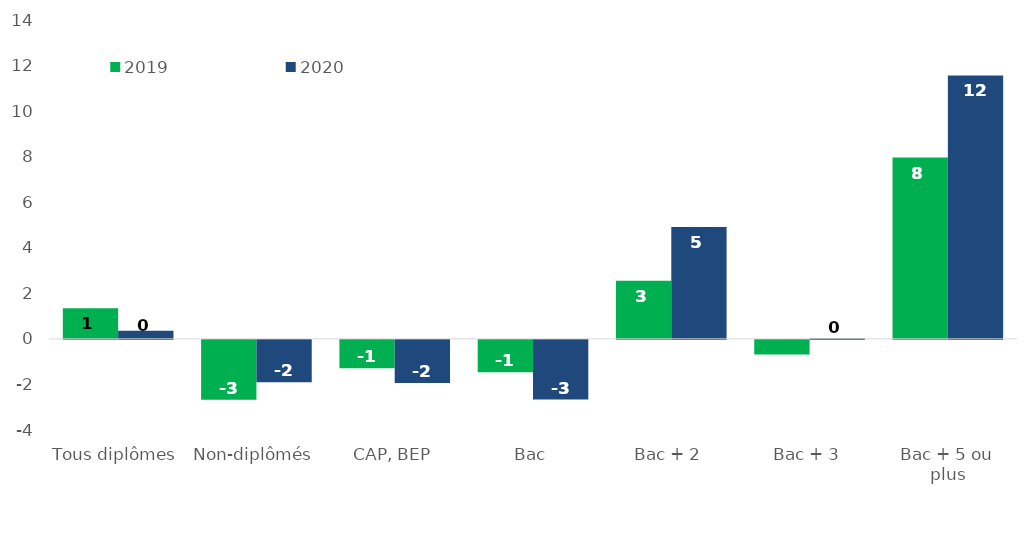
| Category | 2019 | 2020 |
|---|---|---|
| Tous diplômes | 1.346 | 0.357 |
| Non-diplômés | -2.624 | -1.861 |
| CAP, BEP | -1.243 | -1.896 |
| Bac | -1.42 | -2.622 |
| Bac + 2 | 2.554 | 4.916 |
| Bac + 3 | -0.637 | 0.025 |
| Bac + 5 ou plus | 7.958 | 11.567 |